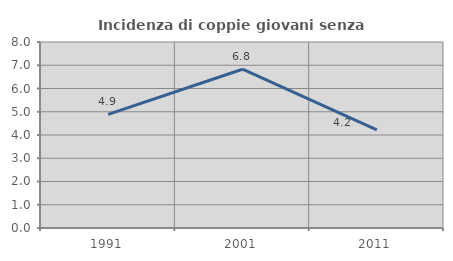
| Category | Incidenza di coppie giovani senza figli |
|---|---|
| 1991.0 | 4.885 |
| 2001.0 | 6.829 |
| 2011.0 | 4.215 |